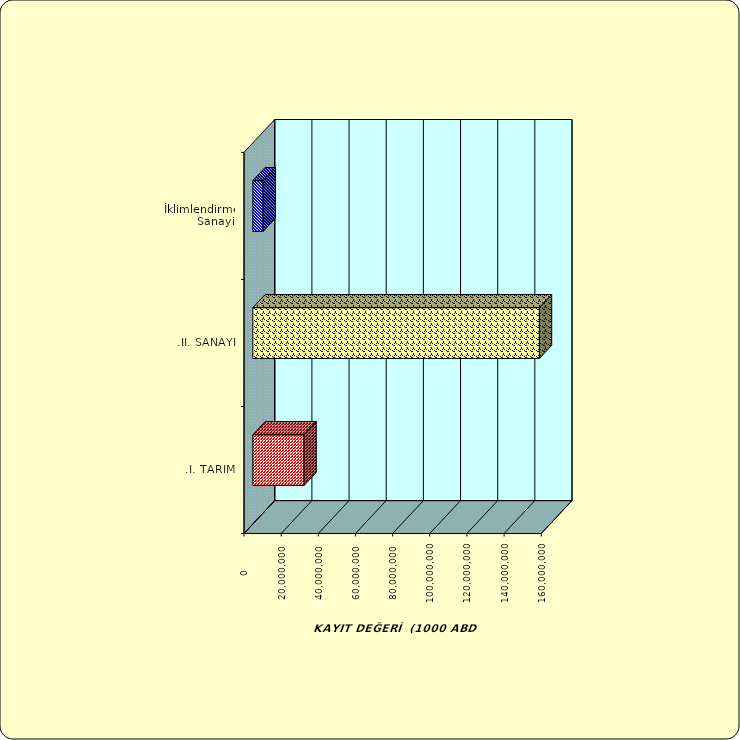
| Category | Series 0 |
|---|---|
| .I. TARIM | 27525565.452 |
| .II. SANAYİ | 154243345.397 |
|  İklimlendirme Sanayii | 5496582.221 |